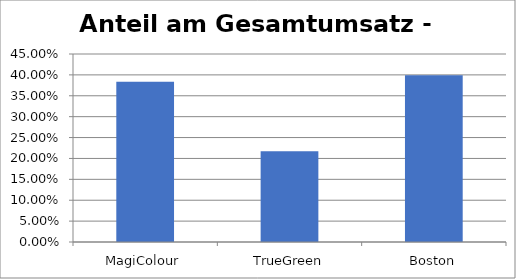
| Category | Series 0 |
|---|---|
| MagiColour | 0.384 |
| TrueGreen | 0.217 |
| Boston | 0.399 |